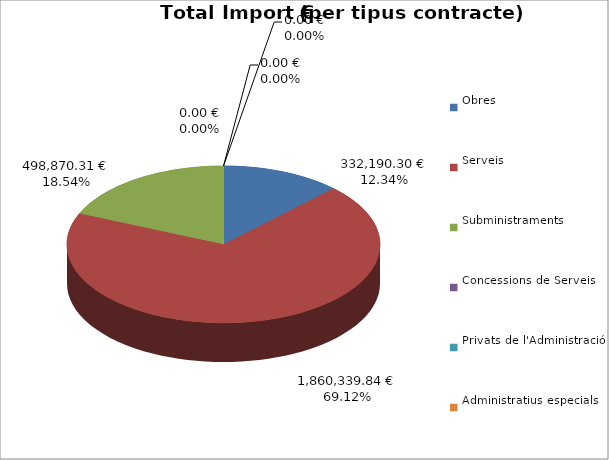
| Category | Total preu
(amb IVA) |
|---|---|
| Obres | 332190.3 |
| Serveis | 1860339.84 |
| Subministraments | 498870.31 |
| Concessions de Serveis | 0 |
| Privats de l'Administració | 0 |
| Administratius especials | 0 |